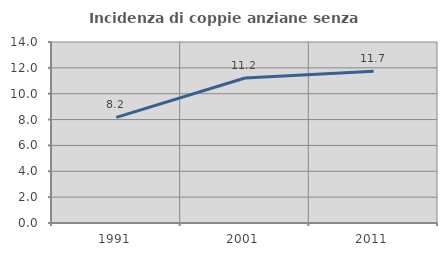
| Category | Incidenza di coppie anziane senza figli  |
|---|---|
| 1991.0 | 8.166 |
| 2001.0 | 11.214 |
| 2011.0 | 11.744 |